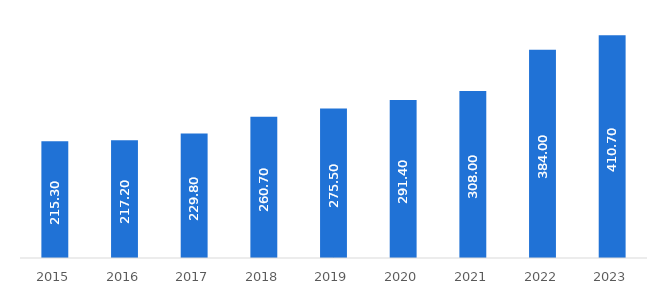
| Category | Arrecadação federal |
|---|---|
| 2023.0 | 410.7 |
| 2022.0 | 384 |
| 2021.0 | 308 |
| 2020.0 | 291.4 |
| 2019.0 | 275.5 |
| 2018.0 | 260.7 |
| 2017.0 | 229.8 |
| 2016.0 | 217.2 |
| 2015.0 | 215.3 |